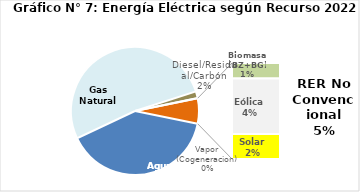
| Category | Series 0 |
|---|---|
| Agua | 2030.573 |
| Gas Natural | 2654.955 |
| Diesel/Residual/Carbón | 88.377 |
| Vapor (Cogeneracion) | 1.685 |
| Biomasa (BZ+BG) | 52.497 |
| Eólica | 188.456 |
| Solar | 85.328 |